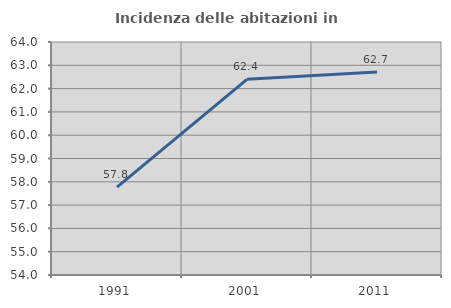
| Category | Incidenza delle abitazioni in proprietà  |
|---|---|
| 1991.0 | 57.773 |
| 2001.0 | 62.397 |
| 2011.0 | 62.716 |